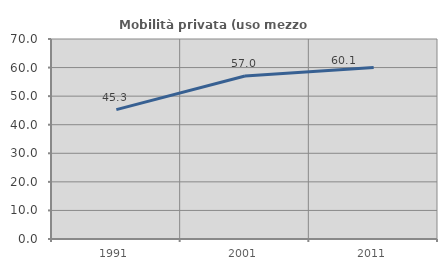
| Category | Mobilità privata (uso mezzo privato) |
|---|---|
| 1991.0 | 45.283 |
| 2001.0 | 57.031 |
| 2011.0 | 60.05 |